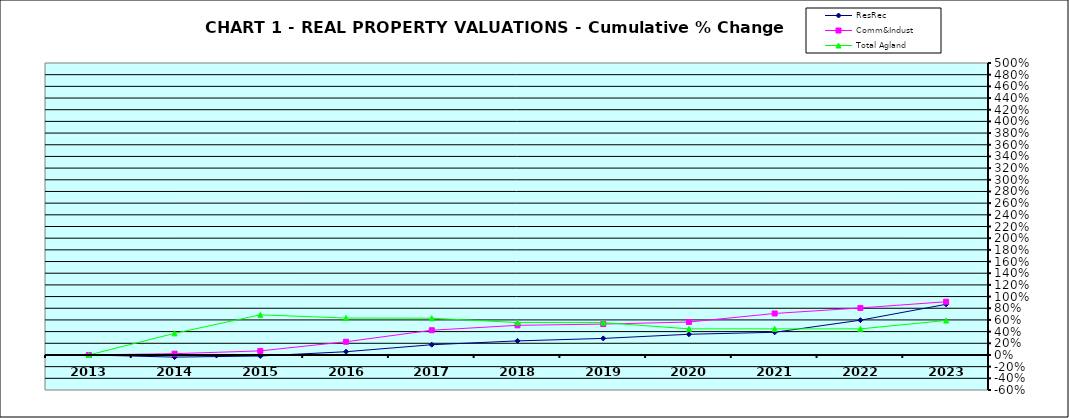
| Category | ResRec | Comm&Indust | Total Agland |
|---|---|---|---|
| 2013.0 | 0 | 0 | 0 |
| 2014.0 | -0.037 | 0.022 | 0.37 |
| 2015.0 | -0.018 | 0.07 | 0.687 |
| 2016.0 | 0.056 | 0.226 | 0.632 |
| 2017.0 | 0.175 | 0.423 | 0.63 |
| 2018.0 | 0.241 | 0.508 | 0.555 |
| 2019.0 | 0.283 | 0.529 | 0.554 |
| 2020.0 | 0.354 | 0.564 | 0.447 |
| 2021.0 | 0.388 | 0.71 | 0.447 |
| 2022.0 | 0.595 | 0.805 | 0.447 |
| 2023.0 | 0.867 | 0.912 | 0.591 |